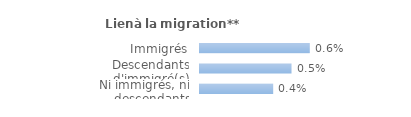
| Category | Series 0 |
|---|---|
| Immigrés | 0.006 |
| Descendants d'immigré(s) | 0.005 |
| Ni immigrés, ni descendants | 0.004 |